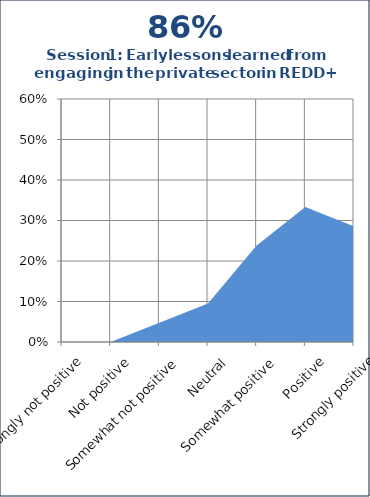
| Category | Series 1 |
|---|---|
| Strongly not positive | 0 |
| Not positive | 0 |
| Somewhat not positive | 0.048 |
| Neutral | 0.095 |
| Somewhat positive | 0.238 |
| Positive | 0.333 |
| Strongly positive | 0.286 |